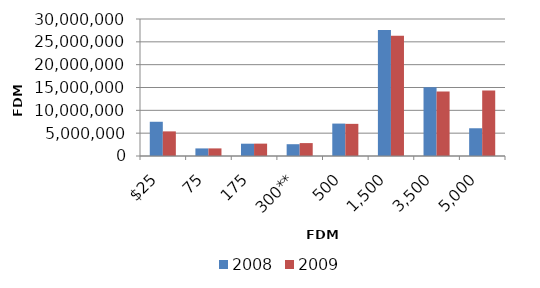
| Category | 2008 | 2009 |
|---|---|---|
| $25 | 7497583 | 5390894 |
| 75 | 1660845 | 1664549 |
| 175 | 2694222 | 2710127 |
| 300** | 2583629 | 2826466 |
| 500 | 7099812 | 7038247 |
| 1,500 | 27610792 | 26355217 |
| 3,500 | 15049598 | 14111640 |
| 5,000 | 6074144 | 14318751 |